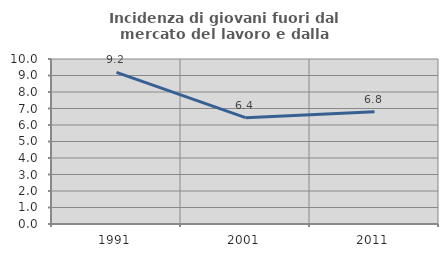
| Category | Incidenza di giovani fuori dal mercato del lavoro e dalla formazione  |
|---|---|
| 1991.0 | 9.189 |
| 2001.0 | 6.445 |
| 2011.0 | 6.804 |